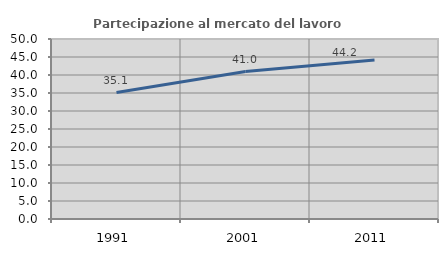
| Category | Partecipazione al mercato del lavoro  femminile |
|---|---|
| 1991.0 | 35.139 |
| 2001.0 | 40.96 |
| 2011.0 | 44.183 |